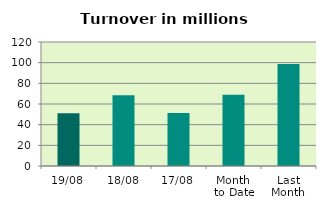
| Category | Series 0 |
|---|---|
| 19/08 | 50.94 |
| 18/08 | 68.354 |
| 17/08 | 51.218 |
| Month 
to Date | 69.006 |
| Last
Month | 98.668 |